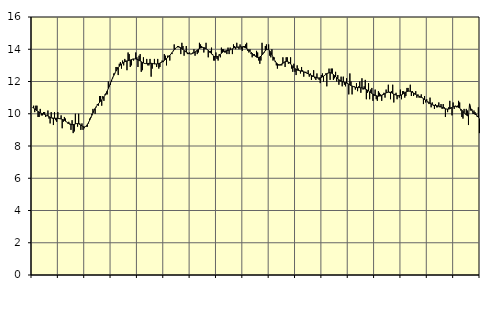
| Category | Piggar | Series 1 |
|---|---|---|
| nan | 10.4 | 10.39 |
| 87.0 | 10.5 | 10.35 |
| 87.0 | 10.1 | 10.3 |
| 87.0 | 10.5 | 10.25 |
| 87.0 | 10.5 | 10.19 |
| 87.0 | 9.8 | 10.14 |
| 87.0 | 9.8 | 10.1 |
| 87.0 | 10.3 | 10.06 |
| 87.0 | 9.9 | 10.03 |
| 87.0 | 9.9 | 10.01 |
| 87.0 | 10.1 | 9.98 |
| 87.0 | 10.1 | 9.96 |
| nan | 9.8 | 9.93 |
| 88.0 | 9.9 | 9.9 |
| 88.0 | 10.2 | 9.86 |
| 88.0 | 9.7 | 9.82 |
| 88.0 | 9.4 | 9.78 |
| 88.0 | 10.1 | 9.76 |
| 88.0 | 9.7 | 9.74 |
| 88.0 | 9.3 | 9.73 |
| 88.0 | 10.1 | 9.72 |
| 88.0 | 9.6 | 9.72 |
| 88.0 | 9.5 | 9.72 |
| 88.0 | 10.1 | 9.71 |
| nan | 9.7 | 9.7 |
| 89.0 | 9.7 | 9.69 |
| 89.0 | 9.9 | 9.68 |
| 89.0 | 9.1 | 9.65 |
| 89.0 | 9.5 | 9.63 |
| 89.0 | 9.8 | 9.59 |
| 89.0 | 9.7 | 9.54 |
| 89.0 | 9.5 | 9.49 |
| 89.0 | 9.4 | 9.44 |
| 89.0 | 9.5 | 9.39 |
| 89.0 | 9.4 | 9.35 |
| 89.0 | 9 | 9.33 |
| nan | 9.6 | 9.32 |
| 90.0 | 8.8 | 9.33 |
| 90.0 | 8.9 | 9.34 |
| 90.0 | 10 | 9.37 |
| 90.0 | 9.4 | 9.39 |
| 90.0 | 9.2 | 9.39 |
| 90.0 | 10 | 9.38 |
| 90.0 | 9.4 | 9.34 |
| 90.0 | 9 | 9.3 |
| 90.0 | 9.4 | 9.24 |
| 90.0 | 9 | 9.2 |
| 90.0 | 9.1 | 9.18 |
| nan | 9.2 | 9.2 |
| 91.0 | 9.2 | 9.25 |
| 91.0 | 9.2 | 9.34 |
| 91.0 | 9.4 | 9.46 |
| 91.0 | 9.7 | 9.6 |
| 91.0 | 9.8 | 9.75 |
| 91.0 | 10 | 9.9 |
| 91.0 | 10.3 | 10.05 |
| 91.0 | 10.2 | 10.2 |
| 91.0 | 10 | 10.33 |
| 91.0 | 10.4 | 10.44 |
| 91.0 | 10.6 | 10.54 |
| nan | 10.5 | 10.62 |
| 92.0 | 11.1 | 10.7 |
| 92.0 | 11.1 | 10.78 |
| 92.0 | 10.5 | 10.86 |
| 92.0 | 11.1 | 10.95 |
| 92.0 | 10.8 | 11.04 |
| 92.0 | 11.2 | 11.15 |
| 92.0 | 11.2 | 11.27 |
| 92.0 | 11.2 | 11.41 |
| 92.0 | 12 | 11.57 |
| 92.0 | 11.7 | 11.73 |
| 92.0 | 11.8 | 11.91 |
| nan | 12 | 12.08 |
| 93.0 | 12.2 | 12.24 |
| 93.0 | 12.5 | 12.38 |
| 93.0 | 12.5 | 12.52 |
| 93.0 | 12.9 | 12.65 |
| 93.0 | 12.9 | 12.76 |
| 93.0 | 12.4 | 12.85 |
| 93.0 | 13.1 | 12.94 |
| 93.0 | 13.2 | 13.02 |
| 93.0 | 12.8 | 13.09 |
| 93.0 | 13.3 | 13.14 |
| 93.0 | 13 | 13.19 |
| nan | 13.4 | 13.22 |
| 94.0 | 13.3 | 13.25 |
| 94.0 | 12.7 | 13.27 |
| 94.0 | 13.8 | 13.29 |
| 94.0 | 13.7 | 13.31 |
| 94.0 | 12.9 | 13.33 |
| 94.0 | 13 | 13.36 |
| 94.0 | 13.4 | 13.38 |
| 94.0 | 13.3 | 13.4 |
| 94.0 | 13.4 | 13.4 |
| 94.0 | 13.8 | 13.4 |
| 94.0 | 13.5 | 13.38 |
| nan | 12.9 | 13.35 |
| 95.0 | 13.6 | 13.31 |
| 95.0 | 13.7 | 13.27 |
| 95.0 | 12.6 | 13.23 |
| 95.0 | 12.7 | 13.18 |
| 95.0 | 13.5 | 13.15 |
| 95.0 | 13.1 | 13.12 |
| 95.0 | 13.1 | 13.11 |
| 95.0 | 13.4 | 13.11 |
| 95.0 | 13 | 13.12 |
| 95.0 | 13 | 13.12 |
| 95.0 | 13.4 | 13.13 |
| nan | 12.3 | 13.13 |
| 96.0 | 12.8 | 13.12 |
| 96.0 | 13.1 | 13.11 |
| 96.0 | 13.4 | 13.09 |
| 96.0 | 13.1 | 13.09 |
| 96.0 | 12.9 | 13.09 |
| 96.0 | 13.4 | 13.1 |
| 96.0 | 12.8 | 13.11 |
| 96.0 | 12.9 | 13.14 |
| 96.0 | 13.2 | 13.18 |
| 96.0 | 13.3 | 13.22 |
| 96.0 | 13.2 | 13.27 |
| nan | 13.7 | 13.31 |
| 97.0 | 13.6 | 13.36 |
| 97.0 | 13 | 13.42 |
| 97.0 | 13.6 | 13.48 |
| 97.0 | 13.6 | 13.55 |
| 97.0 | 13.3 | 13.62 |
| 97.0 | 13.7 | 13.7 |
| 97.0 | 13.7 | 13.79 |
| 97.0 | 13.9 | 13.88 |
| 97.0 | 14.3 | 13.97 |
| 97.0 | 14 | 14.05 |
| 97.0 | 14.1 | 14.1 |
| nan | 14.2 | 14.14 |
| 98.0 | 14.2 | 14.14 |
| 98.0 | 14.1 | 14.13 |
| 98.0 | 13.7 | 14.09 |
| 98.0 | 14.4 | 14.04 |
| 98.0 | 14.2 | 13.98 |
| 98.0 | 13.6 | 13.92 |
| 98.0 | 13.9 | 13.87 |
| 98.0 | 14.2 | 13.82 |
| 98.0 | 13.7 | 13.78 |
| 98.0 | 13.7 | 13.75 |
| 98.0 | 13.8 | 13.72 |
| nan | 13.7 | 13.71 |
| 99.0 | 13.7 | 13.72 |
| 99.0 | 13.8 | 13.75 |
| 99.0 | 14 | 13.78 |
| 99.0 | 13.6 | 13.83 |
| 99.0 | 13.9 | 13.88 |
| 99.0 | 13.7 | 13.94 |
| 99.0 | 13.8 | 14 |
| 99.0 | 14.4 | 14.04 |
| 99.0 | 14.3 | 14.08 |
| 99.0 | 14.2 | 14.1 |
| 99.0 | 14.1 | 14.11 |
| nan | 13.8 | 14.1 |
| 0.0 | 14 | 14.08 |
| 0.0 | 14.4 | 14.04 |
| 0.0 | 14 | 13.99 |
| 0.0 | 13.5 | 13.93 |
| 0.0 | 13.8 | 13.87 |
| 0.0 | 13.9 | 13.79 |
| 0.0 | 14.1 | 13.72 |
| 0.0 | 13.7 | 13.64 |
| 0.0 | 13.3 | 13.58 |
| 0.0 | 13.3 | 13.54 |
| 0.0 | 13.8 | 13.52 |
| nan | 13.4 | 13.54 |
| 1.0 | 13.3 | 13.57 |
| 1.0 | 13.7 | 13.62 |
| 1.0 | 13.5 | 13.68 |
| 1.0 | 14.1 | 13.75 |
| 1.0 | 14 | 13.81 |
| 1.0 | 14 | 13.86 |
| 1.0 | 13.8 | 13.89 |
| 1.0 | 13.8 | 13.9 |
| 1.0 | 13.7 | 13.92 |
| 1.0 | 14.1 | 13.93 |
| 1.0 | 13.7 | 13.94 |
| nan | 14.1 | 13.96 |
| 2.0 | 14 | 14 |
| 2.0 | 13.7 | 14.03 |
| 2.0 | 14.3 | 14.07 |
| 2.0 | 14.2 | 14.1 |
| 2.0 | 14 | 14.12 |
| 2.0 | 14.4 | 14.13 |
| 2.0 | 14.1 | 14.14 |
| 2.0 | 14 | 14.14 |
| 2.0 | 14.3 | 14.15 |
| 2.0 | 14 | 14.15 |
| 2.0 | 13.9 | 14.15 |
| nan | 14.2 | 14.14 |
| 3.0 | 14.2 | 14.12 |
| 3.0 | 14.3 | 14.09 |
| 3.0 | 14.4 | 14.05 |
| 3.0 | 13.9 | 14 |
| 3.0 | 13.8 | 13.94 |
| 3.0 | 14 | 13.88 |
| 3.0 | 13.7 | 13.81 |
| 3.0 | 13.5 | 13.75 |
| 3.0 | 13.6 | 13.68 |
| 3.0 | 13.7 | 13.61 |
| 3.0 | 13.6 | 13.56 |
| nan | 13.9 | 13.51 |
| 4.0 | 13.8 | 13.49 |
| 4.0 | 13.3 | 13.49 |
| 4.0 | 13.1 | 13.52 |
| 4.0 | 13.3 | 13.57 |
| 4.0 | 14.4 | 13.65 |
| 4.0 | 13.7 | 13.74 |
| 4.0 | 13.8 | 13.83 |
| 4.0 | 14.2 | 13.91 |
| 4.0 | 14.3 | 13.97 |
| 4.0 | 14 | 13.99 |
| 4.0 | 14.3 | 13.97 |
| nan | 13.6 | 13.9 |
| 5.0 | 13.5 | 13.8 |
| 5.0 | 14 | 13.66 |
| 5.0 | 13.3 | 13.52 |
| 5.0 | 13.5 | 13.38 |
| 5.0 | 13.2 | 13.26 |
| 5.0 | 13 | 13.16 |
| 5.0 | 12.8 | 13.09 |
| 5.0 | 13 | 13.05 |
| 5.0 | 13 | 13.04 |
| 5.0 | 13 | 13.05 |
| 5.0 | 13 | 13.09 |
| nan | 13.5 | 13.13 |
| 6.0 | 13.2 | 13.18 |
| 6.0 | 12.9 | 13.23 |
| 6.0 | 13.5 | 13.25 |
| 6.0 | 13.5 | 13.24 |
| 6.0 | 13.1 | 13.21 |
| 6.0 | 13.2 | 13.16 |
| 6.0 | 13.5 | 13.09 |
| 6.0 | 12.8 | 13.01 |
| 6.0 | 12.6 | 12.93 |
| 6.0 | 13.1 | 12.86 |
| 6.0 | 12.6 | 12.8 |
| nan | 12.4 | 12.75 |
| 7.0 | 13 | 12.71 |
| 7.0 | 12.8 | 12.69 |
| 7.0 | 12.7 | 12.67 |
| 7.0 | 12.5 | 12.66 |
| 7.0 | 12.9 | 12.64 |
| 7.0 | 12.7 | 12.63 |
| 7.0 | 12.3 | 12.6 |
| 7.0 | 12.6 | 12.57 |
| 7.0 | 12.6 | 12.54 |
| 7.0 | 12.5 | 12.51 |
| 7.0 | 12.7 | 12.47 |
| nan | 12.3 | 12.44 |
| 8.0 | 12.5 | 12.41 |
| 8.0 | 12.1 | 12.38 |
| 8.0 | 12.3 | 12.35 |
| 8.0 | 12.7 | 12.31 |
| 8.0 | 12.2 | 12.28 |
| 8.0 | 12.1 | 12.26 |
| 8.0 | 12.5 | 12.23 |
| 8.0 | 12.2 | 12.22 |
| 8.0 | 12.1 | 12.22 |
| 8.0 | 11.9 | 12.23 |
| 8.0 | 12.4 | 12.25 |
| nan | 12.5 | 12.29 |
| 9.0 | 12 | 12.33 |
| 9.0 | 12.4 | 12.38 |
| 9.0 | 12.5 | 12.44 |
| 9.0 | 11.7 | 12.49 |
| 9.0 | 12.5 | 12.52 |
| 9.0 | 12.8 | 12.55 |
| 9.0 | 12.1 | 12.55 |
| 9.0 | 12.8 | 12.53 |
| 9.0 | 12.8 | 12.49 |
| 9.0 | 12.1 | 12.43 |
| 9.0 | 12.2 | 12.37 |
| nan | 12.6 | 12.3 |
| 10.0 | 12 | 12.23 |
| 10.0 | 12.4 | 12.17 |
| 10.0 | 11.8 | 12.11 |
| 10.0 | 12 | 12.06 |
| 10.0 | 12.3 | 12.02 |
| 10.0 | 11.7 | 12 |
| 10.0 | 12.3 | 11.97 |
| 10.0 | 11.8 | 11.95 |
| 10.0 | 11.7 | 11.93 |
| 10.0 | 12.2 | 11.9 |
| 10.0 | 11.9 | 11.87 |
| nan | 11.2 | 11.83 |
| 11.0 | 12.5 | 11.79 |
| 11.0 | 12 | 11.75 |
| 11.0 | 11.2 | 11.72 |
| 11.0 | 11.7 | 11.69 |
| 11.0 | 11.7 | 11.66 |
| 11.0 | 11.5 | 11.64 |
| 11.0 | 11.9 | 11.63 |
| 11.0 | 11.4 | 11.62 |
| 11.0 | 11.7 | 11.62 |
| 11.0 | 12 | 11.62 |
| 11.0 | 11.3 | 11.61 |
| nan | 12.2 | 11.6 |
| 12.0 | 11.5 | 11.59 |
| 12.0 | 11.7 | 11.56 |
| 12.0 | 12.1 | 11.53 |
| 12.0 | 10.9 | 11.5 |
| 12.0 | 11.3 | 11.46 |
| 12.0 | 11.9 | 11.41 |
| 12.0 | 10.9 | 11.36 |
| 12.0 | 11.5 | 11.31 |
| 12.0 | 11.6 | 11.26 |
| 12.0 | 10.8 | 11.22 |
| 12.0 | 11.1 | 11.18 |
| nan | 11.5 | 11.14 |
| 13.0 | 10.9 | 11.12 |
| 13.0 | 10.8 | 11.1 |
| 13.0 | 11.4 | 11.09 |
| 13.0 | 11.3 | 11.1 |
| 13.0 | 11.2 | 11.11 |
| 13.0 | 10.8 | 11.14 |
| 13.0 | 11.2 | 11.17 |
| 13.0 | 11.3 | 11.21 |
| 13.0 | 11 | 11.25 |
| 13.0 | 11.5 | 11.29 |
| 13.0 | 11.3 | 11.32 |
| nan | 11.8 | 11.34 |
| 14.0 | 11.3 | 11.34 |
| 14.0 | 10.9 | 11.33 |
| 14.0 | 11.4 | 11.3 |
| 14.0 | 11.8 | 11.26 |
| 14.0 | 10.7 | 11.22 |
| 14.0 | 11.2 | 11.19 |
| 14.0 | 11.3 | 11.16 |
| 14.0 | 10.9 | 11.13 |
| 14.0 | 11.1 | 11.12 |
| 14.0 | 11 | 11.13 |
| 14.0 | 11.5 | 11.14 |
| nan | 10.9 | 11.17 |
| 15.0 | 11.4 | 11.21 |
| 15.0 | 11.4 | 11.26 |
| 15.0 | 11 | 11.31 |
| 15.0 | 11.1 | 11.35 |
| 15.0 | 11.6 | 11.38 |
| 15.0 | 11.6 | 11.4 |
| 15.0 | 11.4 | 11.4 |
| 15.0 | 11.8 | 11.39 |
| 15.0 | 11.1 | 11.37 |
| 15.0 | 11.4 | 11.33 |
| 15.0 | 11.1 | 11.29 |
| nan | 11.2 | 11.25 |
| 16.0 | 11.4 | 11.2 |
| 16.0 | 11 | 11.16 |
| 16.0 | 11.2 | 11.13 |
| 16.0 | 11 | 11.09 |
| 16.0 | 11 | 11.06 |
| 16.0 | 11.2 | 11.02 |
| 16.0 | 11 | 10.98 |
| 16.0 | 10.6 | 10.93 |
| 16.0 | 11.1 | 10.88 |
| 16.0 | 10.7 | 10.84 |
| 16.0 | 10.9 | 10.79 |
| nan | 10.7 | 10.74 |
| 17.0 | 10.6 | 10.7 |
| 17.0 | 11 | 10.65 |
| 17.0 | 10.4 | 10.61 |
| 17.0 | 10.7 | 10.57 |
| 17.0 | 10.5 | 10.54 |
| 17.0 | 10.3 | 10.52 |
| 17.0 | 10.6 | 10.51 |
| 17.0 | 10.4 | 10.5 |
| 17.0 | 10.4 | 10.49 |
| 17.0 | 10.7 | 10.47 |
| 17.0 | 10.4 | 10.45 |
| nan | 10.6 | 10.42 |
| 18.0 | 10.3 | 10.39 |
| 18.0 | 10.6 | 10.36 |
| 18.0 | 10.4 | 10.33 |
| 18.0 | 9.8 | 10.31 |
| 18.0 | 10.3 | 10.29 |
| 18.0 | 10.1 | 10.29 |
| 18.0 | 10.4 | 10.29 |
| 18.0 | 10.8 | 10.31 |
| 18.0 | 10.4 | 10.34 |
| 18.0 | 9.9 | 10.39 |
| 18.0 | 10.7 | 10.43 |
| nan | 10.3 | 10.45 |
| 19.0 | 10.5 | 10.46 |
| 19.0 | 10.4 | 10.46 |
| 19.0 | 10.5 | 10.43 |
| 19.0 | 10.8 | 10.39 |
| 19.0 | 10.7 | 10.35 |
| 19.0 | 10.2 | 10.29 |
| 19.0 | 9.8 | 10.22 |
| 19.0 | 9.7 | 10.14 |
| 19.0 | 10.3 | 10.06 |
| 19.0 | 10 | 9.99 |
| 19.0 | 10.3 | 9.93 |
| nan | 10.2 | 9.88 |
| 20.0 | 9.3 | 9.85 |
| 20.0 | 10.6 | 10.61 |
| 20.0 | 10.2 | 10.29 |
| 20.0 | 10.2 | 10.28 |
| 20.0 | 10 | 10.05 |
| 20.0 | 10.2 | 10.01 |
| 20.0 | 10.1 | 9.97 |
| 20.0 | 10 | 9.93 |
| 20.0 | 9.8 | 9.86 |
| 20.0 | 10.4 | 9.79 |
| 20.0 | 8.8 | 9.7 |